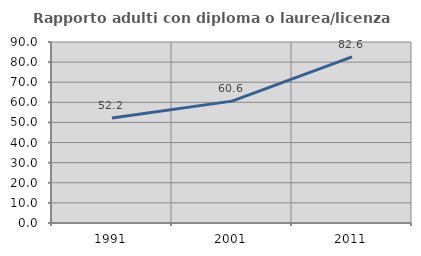
| Category | Rapporto adulti con diploma o laurea/licenza media  |
|---|---|
| 1991.0 | 52.239 |
| 2001.0 | 60.606 |
| 2011.0 | 82.558 |